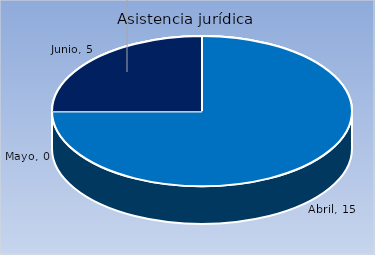
| Category | Cantidad |
|---|---|
| Abril | 15 |
| Mayo | 0 |
| Junio | 5 |